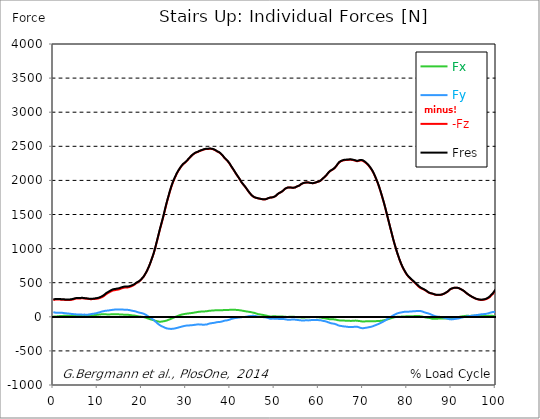
| Category |  Fx |  Fy |  -Fz |  Fres |
|---|---|---|---|---|
| 0.0 | 6.77 | 68.24 | 244.67 | 254.99 |
| 0.16678370786516855 | 5.96 | 65.32 | 247.83 | 257.23 |
| 0.3335674157303371 | 5.31 | 62.63 | 250.74 | 259.34 |
| 0.5003511235955057 | 5.2 | 60.64 | 252.82 | 260.87 |
| 0.6671348314606742 | 5.5 | 59.16 | 254.23 | 261.9 |
| 0.8339185393258427 | 6.13 | 58.37 | 255.19 | 262.7 |
| 1.0007022471910114 | 7.12 | 58.39 | 255 | 262.59 |
| 1.1674859550561796 | 8.33 | 58.54 | 253.81 | 261.53 |
| 1.3342696629213484 | 9.66 | 58.94 | 252.47 | 260.38 |
| 1.5010533707865168 | 10.88 | 59.1 | 251.46 | 259.47 |
| 1.6678370786516854 | 11.76 | 58.99 | 251.12 | 259.21 |
| 1.8346207865168538 | 12.53 | 58.95 | 250.75 | 258.95 |
| 2.001404494382023 | 13.15 | 58.54 | 250.4 | 258.62 |
| 2.1681882022471908 | 13.65 | 56.49 | 250.34 | 258.16 |
| 2.334971910112359 | 14.25 | 54.51 | 249.81 | 257.38 |
| 2.501755617977528 | 15.44 | 54.5 | 247.5 | 255.6 |
| 2.668539325842697 | 16.2 | 53.14 | 246.08 | 254.3 |
| 2.8353230337078656 | 16.72 | 51.03 | 245.19 | 253.27 |
| 3.0021067415730336 | 17 | 50.12 | 244.87 | 253.09 |
| 3.168890449438202 | 17.16 | 49.36 | 244.77 | 253.19 |
| 3.335674157303371 | 17.19 | 48.35 | 244.69 | 253.33 |
| 3.502457865168539 | 17.06 | 47.54 | 245.09 | 253.88 |
| 3.6692415730337076 | 16.56 | 45.88 | 245.7 | 254.63 |
| 3.8360252808988764 | 16.11 | 44.4 | 246.76 | 255.71 |
| 4.002808988764046 | 15.69 | 43.02 | 248.08 | 256.96 |
| 4.169592696629214 | 15.04 | 41.38 | 249.92 | 258.51 |
| 4.3363764044943816 | 14.46 | 40.17 | 252.55 | 260.88 |
| 4.50316011235955 | 13.87 | 39.31 | 255.35 | 263.66 |
| 4.669943820224718 | 13.07 | 38.7 | 258.65 | 266.85 |
| 4.836727528089888 | 12.11 | 38.46 | 262.52 | 270.39 |
| 5.003511235955056 | 11.34 | 36.7 | 266.02 | 273.24 |
| 5.170294943820225 | 10.97 | 35.02 | 267.89 | 274.67 |
| 5.337078651685394 | 10.94 | 34.14 | 268.8 | 275.49 |
| 5.5038623595505625 | 11.17 | 33.52 | 269.2 | 275.87 |
| 5.670646067415731 | 11.69 | 33.95 | 269.04 | 276.06 |
| 5.837429775280899 | 12.12 | 35.11 | 268.19 | 275.79 |
| 6.004213483146067 | 11.76 | 34.64 | 268.47 | 276.12 |
| 6.170997191011236 | 10.75 | 33.51 | 270.1 | 277.31 |
| 6.329002808988764 | 10.42 | 32.67 | 270.91 | 277.79 |
| 6.495786516853932 | 10.38 | 31.97 | 271.08 | 277.71 |
| 6.662570224719101 | 10.25 | 31.25 | 271.05 | 277.47 |
| 6.82935393258427 | 10.48 | 31.51 | 269.79 | 276.24 |
| 6.9961376404494375 | 10.57 | 32.17 | 267.78 | 274.33 |
| 7.162921348314607 | 10.98 | 32.49 | 266.47 | 272.81 |
| 7.329705056179775 | 10.86 | 31.39 | 266.16 | 271.95 |
| 7.496488764044945 | 10.69 | 30.09 | 265.94 | 271.19 |
| 7.663272471910113 | 11.69 | 30.53 | 264.7 | 269.82 |
| 7.830056179775281 | 12.95 | 31.4 | 263.22 | 268.31 |
| 7.996839887640449 | 14.57 | 32.84 | 261.37 | 266.55 |
| 8.16362359550562 | 16.71 | 35.58 | 259.73 | 265.01 |
| 8.330407303370787 | 18.45 | 37.59 | 258.92 | 264.43 |
| 8.497191011235955 | 19.89 | 39.4 | 258.87 | 264.65 |
| 8.663974719101123 | 21.21 | 41.24 | 259.03 | 265.01 |
| 8.830758426966291 | 22.41 | 42.95 | 259.27 | 265.49 |
| 8.99754213483146 | 23.43 | 44.48 | 259.69 | 266.24 |
| 9.16432584269663 | 24.67 | 46.52 | 260.41 | 267.33 |
| 9.331109550561798 | 25.41 | 47.92 | 261.6 | 268.86 |
| 9.497893258426966 | 26.22 | 49.71 | 263.22 | 270.85 |
| 9.664676966292134 | 27.04 | 51.59 | 265.15 | 273.14 |
| 9.831460674157304 | 28.43 | 54.6 | 266.07 | 274.69 |
| 9.998244382022472 | 30.07 | 57.94 | 266.59 | 275.78 |
| 10.16502808988764 | 31 | 60.41 | 269.21 | 278.88 |
| 10.331811797752808 | 32.28 | 63.57 | 272.11 | 282.42 |
| 10.498595505617978 | 33.64 | 67.04 | 275.6 | 286.66 |
| 10.665379213483147 | 34.96 | 70.65 | 279.61 | 291.5 |
| 10.832162921348315 | 36.14 | 74.5 | 284.06 | 296.89 |
| 10.998946629213483 | 37.16 | 78.09 | 288.75 | 302.4 |
| 11.165730337078653 | 37.43 | 81.02 | 293.72 | 307.85 |
| 11.33251404494382 | 36.81 | 81.95 | 300.66 | 314.64 |
| 11.49929775280899 | 36.75 | 84.15 | 308.43 | 322.74 |
| 11.666081460674157 | 36.86 | 87.07 | 316.99 | 331.8 |
| 11.832865168539326 | 36.31 | 89.04 | 326.48 | 341.4 |
| 11.999648876404493 | 35.58 | 90.31 | 334.95 | 349.82 |
| 12.166432584269662 | 34.49 | 89.71 | 341.06 | 355.54 |
| 12.333216292134832 | 34.27 | 90.8 | 347.99 | 362.5 |
| 12.5 | 34.19 | 92.49 | 354.2 | 368.84 |
| 12.66678370786517 | 35.03 | 95.05 | 359.97 | 375.13 |
| 12.833567415730336 | 35.47 | 96.88 | 366.09 | 381.57 |
| 13.000351123595506 | 35.78 | 98.63 | 372.51 | 388.26 |
| 13.167134831460674 | 35.92 | 100.33 | 378.04 | 393.95 |
| 13.333918539325843 | 35.59 | 101.38 | 382.77 | 398.76 |
| 13.500702247191011 | 35.29 | 102.45 | 387.41 | 403.49 |
| 13.667485955056181 | 35.58 | 103.75 | 389.44 | 405.83 |
| 13.834269662921349 | 35.7 | 105.18 | 390.29 | 407.1 |
| 14.001053370786519 | 35.76 | 107.05 | 391.12 | 408.52 |
| 14.167837078651687 | 35.48 | 106.94 | 393.88 | 411.02 |
| 14.334620786516853 | 35.56 | 107.2 | 396.8 | 413.79 |
| 14.501404494382026 | 35.91 | 107.84 | 398.32 | 415.37 |
| 14.668188202247192 | 36.15 | 108.33 | 399.52 | 416.62 |
| 14.834971910112362 | 35.87 | 108.29 | 401.75 | 418.68 |
| 15.001755617977528 | 34.93 | 107.48 | 405.58 | 422.06 |
| 15.168539325842698 | 33.93 | 106.72 | 410.23 | 426.29 |
| 15.335323033707864 | 33 | 106.15 | 414.94 | 430.61 |
| 15.502106741573034 | 32.81 | 106.21 | 418.32 | 433.88 |
| 15.6688904494382 | 32.44 | 105.83 | 421.17 | 436.72 |
| 15.83567415730337 | 31.26 | 104.54 | 424.58 | 439.86 |
| 16.00245786516854 | 31 | 104.65 | 426.95 | 442.21 |
| 16.16924157303371 | 30.51 | 104.22 | 429.89 | 444.89 |
| 16.336025280898877 | 30.11 | 103.46 | 430.72 | 445.42 |
| 16.502808988764045 | 30.5 | 103.91 | 429.28 | 444.19 |
| 16.669592696629216 | 29.94 | 103.01 | 429.83 | 444.42 |
| 16.83637640449438 | 29.27 | 101.98 | 430.6 | 444.8 |
| 17.003160112359552 | 28.29 | 100.57 | 432.49 | 446.19 |
| 17.169943820224717 | 26.95 | 98.7 | 435.69 | 448.73 |
| 17.336727528089888 | 25.54 | 96.62 | 439.25 | 451.59 |
| 17.503511235955056 | 23.83 | 93.93 | 443.56 | 455.03 |
| 17.670294943820224 | 22.12 | 91.17 | 448.25 | 458.86 |
| 17.837078651685395 | 20.47 | 88.41 | 453.55 | 463.36 |
| 18.003862359550563 | 19.4 | 86.38 | 458.48 | 467.72 |
| 18.17064606741573 | 18.46 | 84.69 | 464.38 | 473.19 |
| 18.3374297752809 | 17.52 | 82.89 | 471.57 | 479.97 |
| 18.504213483146067 | 15.92 | 80.27 | 479.82 | 487.67 |
| 18.662219101123597 | 14.4 | 77.2 | 488.22 | 495.38 |
| 18.829002808988765 | 11.99 | 73.23 | 496.5 | 502.74 |
| 18.995786516853933 | 9.49 | 69.12 | 504.52 | 509.89 |
| 19.1625702247191 | 7.38 | 65.64 | 510.95 | 515.73 |
| 19.32935393258427 | 5.55 | 62.9 | 516.37 | 520.7 |
| 19.49613764044944 | 4.31 | 60.51 | 524.13 | 528.15 |
| 19.662921348314608 | 3 | 58.02 | 533.93 | 537.62 |
| 19.829705056179776 | 1.78 | 55.58 | 545.12 | 548.5 |
| 19.996488764044944 | 0.47 | 53.06 | 557.03 | 560.14 |
| 20.163272471910112 | -0.99 | 50.41 | 569.26 | 572.12 |
| 20.33005617977528 | -2.82 | 47.13 | 581.9 | 584.42 |
| 20.49683988764045 | -5.4 | 42.63 | 597.82 | 599.94 |
| 20.663623595505616 | -8.35 | 37.53 | 615.41 | 617.18 |
| 20.830407303370787 | -11.56 | 31.98 | 634.02 | 635.49 |
| 20.997191011235955 | -15.26 | 25.65 | 653.67 | 654.87 |
| 21.163974719101123 | -19.24 | 18.64 | 674.31 | 675.32 |
| 21.330758426966295 | -23.14 | 11.49 | 697.17 | 698.14 |
| 21.497542134831463 | -26.95 | 4.47 | 721.45 | 722.47 |
| 21.66432584269663 | -30.76 | -2.52 | 746.66 | 747.84 |
| 21.8311095505618 | -34.29 | -9.3 | 773.42 | 774.82 |
| 21.997893258426966 | -37.46 | -16.08 | 802.33 | 803.94 |
| 22.164676966292134 | -40.49 | -22.75 | 832.53 | 834.43 |
| 22.331460674157306 | -43.45 | -29.67 | 863.91 | 866.1 |
| 22.498244382022467 | -46.64 | -37.57 | 894.18 | 896.64 |
| 22.66502808988764 | -49.98 | -46.07 | 926.1 | 928.95 |
| 22.831811797752806 | -53.51 | -55.36 | 963.42 | 966.84 |
| 22.99859550561798 | -57.2 | -65.04 | 1002.7 | 1006.77 |
| 23.165379213483146 | -60.67 | -74.74 | 1043.86 | 1048.62 |
| 23.332162921348313 | -63.52 | -84.2 | 1085.75 | 1091.15 |
| 23.49894662921348 | -66.3 | -93.83 | 1128.55 | 1134.61 |
| 23.665730337078653 | -68.82 | -103.27 | 1171.5 | 1178.23 |
| 23.83251404494382 | -71.01 | -112.29 | 1214.82 | 1222.2 |
| 23.999297752808985 | -71.75 | -119.87 | 1256.66 | 1264.52 |
| 24.166081460674157 | -72.25 | -126.82 | 1298.53 | 1306.82 |
| 24.332865168539325 | -71.32 | -132.54 | 1337.68 | 1346.24 |
| 24.499648876404496 | -69.86 | -138.04 | 1378.37 | 1387.14 |
| 24.666432584269664 | -68.48 | -143.17 | 1417.97 | 1426.93 |
| 24.833216292134832 | -66.71 | -148.01 | 1459.51 | 1468.62 |
| 25.0 | -64.48 | -153.1 | 1503.42 | 1512.7 |
| 25.16678370786517 | -62.4 | -158.11 | 1548.12 | 1557.55 |
| 25.33356741573034 | -60.05 | -162.77 | 1592.42 | 1601.98 |
| 25.500351123595504 | -57.54 | -166.95 | 1635.59 | 1645.23 |
| 25.66713483146067 | -54.26 | -170.47 | 1677.56 | 1687.24 |
| 25.833918539325843 | -49.8 | -172.4 | 1717.24 | 1726.78 |
| 26.00070224719101 | -44.96 | -173.77 | 1756.19 | 1765.54 |
| 26.16748595505618 | -40.65 | -175.21 | 1794.8 | 1804 |
| 26.334269662921347 | -36.8 | -176.88 | 1833.61 | 1842.7 |
| 26.50105337078652 | -32.45 | -177.64 | 1870.06 | 1878.98 |
| 26.667837078651687 | -27.68 | -177.36 | 1903.18 | 1911.85 |
| 26.834620786516858 | -22.7 | -176.86 | 1935.41 | 1943.81 |
| 27.001404494382022 | -17.88 | -175.98 | 1965.55 | 1973.69 |
| 27.16818820224719 | -13.28 | -174.42 | 1992.46 | 2000.36 |
| 27.334971910112362 | -8.49 | -172.25 | 2017.78 | 2025.38 |
| 27.50175561797753 | -3.7 | -169.98 | 2041.63 | 2048.97 |
| 27.668539325842698 | 0.84 | -167.71 | 2065.34 | 2072.44 |
| 27.835323033707866 | 5.22 | -165.03 | 2088.49 | 2095.32 |
| 28.002106741573037 | 9.65 | -162.17 | 2109.69 | 2116.25 |
| 28.168890449438205 | 13.98 | -159.19 | 2129.26 | 2135.57 |
| 28.335674157303373 | 18.34 | -156.13 | 2147.59 | 2153.65 |
| 28.502457865168537 | 22.32 | -153.15 | 2164.63 | 2170.44 |
| 28.669241573033705 | 25.71 | -150.31 | 2180.25 | 2185.86 |
| 28.836025280898877 | 29.35 | -147.22 | 2196.32 | 2201.69 |
| 29.002808988764052 | 32.45 | -144.4 | 2211.21 | 2216.39 |
| 29.169592696629213 | 34.82 | -141.86 | 2224.33 | 2229.36 |
| 29.336376404494384 | 37.35 | -139.1 | 2236.45 | 2241.32 |
| 29.50316011235955 | 39.8 | -136.35 | 2246.83 | 2251.56 |
| 29.669943820224724 | 41.55 | -133.58 | 2254.25 | 2258.87 |
| 29.836727528089884 | 43.07 | -131.33 | 2262.78 | 2267.28 |
| 30.003511235955056 | 44.41 | -129.66 | 2272.78 | 2277.16 |
| 30.170294943820224 | 47.63 | -126.87 | 2283.88 | 2288.09 |
| 30.337078651685395 | 48.55 | -127.15 | 2296.14 | 2300.34 |
| 30.503862359550563 | 49.24 | -127.43 | 2308.54 | 2312.72 |
| 30.670646067415728 | 50.36 | -126.82 | 2320.39 | 2324.52 |
| 30.837429775280903 | 52.33 | -125.16 | 2331.25 | 2335.3 |
| 30.99543539325843 | 53.48 | -124.42 | 2343.88 | 2347.88 |
| 31.162219101123597 | 54.5 | -124.13 | 2355.46 | 2359.44 |
| 31.32900280898876 | 55.69 | -123.06 | 2366.09 | 2370.02 |
| 31.495786516853936 | 57.2 | -121.81 | 2375.76 | 2379.65 |
| 31.6625702247191 | 59.25 | -120.29 | 2383.64 | 2387.49 |
| 31.82935393258427 | 61.4 | -118.74 | 2391.14 | 2394.95 |
| 31.996137640449433 | 63.52 | -117.24 | 2398.47 | 2402.24 |
| 32.162921348314605 | 65.12 | -115.87 | 2404.39 | 2408.13 |
| 32.329705056179776 | 66.51 | -114.65 | 2409.54 | 2413.25 |
| 32.49648876404494 | 68.72 | -113 | 2413.45 | 2417.15 |
| 32.66327247191011 | 71.61 | -110.8 | 2417.14 | 2420.82 |
| 32.83005617977528 | 72.19 | -111.24 | 2423.79 | 2427.49 |
| 32.996839887640455 | 73.23 | -111.36 | 2429.13 | 2432.85 |
| 33.16362359550562 | 74.77 | -110.97 | 2433.14 | 2436.88 |
| 33.330407303370784 | 76.12 | -111.24 | 2436.7 | 2440.5 |
| 33.497191011235955 | 76.99 | -113.12 | 2439.49 | 2443.4 |
| 33.66397471910113 | 77.08 | -115.26 | 2443.89 | 2447.91 |
| 33.83075842696629 | 77.3 | -116.39 | 2448.62 | 2452.7 |
| 33.997542134831455 | 78.05 | -115.87 | 2452.34 | 2456.43 |
| 34.164325842696634 | 78.82 | -115.25 | 2455.3 | 2459.38 |
| 34.3311095505618 | 79.87 | -114.36 | 2457.93 | 2462 |
| 34.49789325842697 | 80.17 | -114.02 | 2459.8 | 2463.88 |
| 34.66467696629213 | 80.05 | -113.92 | 2461.5 | 2465.6 |
| 34.831460674157306 | 82.3 | -110.5 | 2461.79 | 2465.86 |
| 34.99824438202247 | 85.93 | -104.34 | 2461.35 | 2465.39 |
| 35.16502808988764 | 87.78 | -101.05 | 2462.41 | 2466.45 |
| 35.331811797752806 | 89.14 | -98.27 | 2463.2 | 2467.23 |
| 35.49859550561798 | 89.7 | -96.65 | 2462.85 | 2466.86 |
| 35.66537921348315 | 90.35 | -94.55 | 2462.17 | 2466.14 |
| 35.83216292134831 | 91.54 | -92.3 | 2460.56 | 2464.49 |
| 35.998946629213485 | 92.21 | -90.98 | 2458.35 | 2462.26 |
| 36.16573033707865 | 92.88 | -89.89 | 2455.62 | 2459.52 |
| 36.33251404494382 | 93.52 | -88.53 | 2451.07 | 2455 |
| 36.499297752808985 | 94.32 | -86.69 | 2445.79 | 2449.7 |
| 36.666081460674164 | 95.43 | -84.32 | 2440.17 | 2444.06 |
| 36.83286516853932 | 96.79 | -81.1 | 2433.27 | 2437.15 |
| 36.99964887640449 | 97.8 | -78.5 | 2425.89 | 2429.73 |
| 37.166432584269664 | 97.37 | -77.44 | 2419.88 | 2423.66 |
| 37.333216292134836 | 95.83 | -77.16 | 2414.99 | 2418.72 |
| 37.5 | 94.33 | -76.84 | 2410.01 | 2413.67 |
| 37.666783707865164 | 94.31 | -75.38 | 2401.98 | 2405.61 |
| 37.833567415730336 | 94.84 | -73.25 | 2392.37 | 2395.96 |
| 38.00035112359551 | 95.66 | -70.79 | 2381.68 | 2385.24 |
| 38.16713483146068 | 96.28 | -68.7 | 2370.65 | 2374.21 |
| 38.333918539325836 | 97.18 | -65 | 2358.51 | 2362.05 |
| 38.50070224719101 | 99.11 | -60.39 | 2343.98 | 2347.51 |
| 38.66748595505618 | 100.54 | -56.8 | 2329.68 | 2333.22 |
| 38.83426966292135 | 100.5 | -55.3 | 2318.56 | 2322.06 |
| 39.001053370786515 | 99.92 | -54.64 | 2309.24 | 2312.7 |
| 39.16783707865169 | 99.65 | -53.85 | 2299.81 | 2303.25 |
| 39.33462078651686 | 99.72 | -51.21 | 2287.49 | 2290.88 |
| 39.50140449438202 | 100.42 | -48.46 | 2274.17 | 2277.57 |
| 39.668188202247194 | 100.96 | -45.77 | 2261.31 | 2264.68 |
| 39.83497191011236 | 101.55 | -41.83 | 2245.82 | 2249.18 |
| 40.00175561797753 | 102.45 | -37.64 | 2229.16 | 2232.54 |
| 40.168539325842694 | 103.13 | -32.5 | 2210.41 | 2213.83 |
| 40.335323033707866 | 103.08 | -29.58 | 2194.05 | 2197.48 |
| 40.50210674157304 | 103.23 | -26.7 | 2178.1 | 2181.49 |
| 40.6688904494382 | 103.26 | -24.22 | 2161.7 | 2165.05 |
| 40.83567415730337 | 103.2 | -21.67 | 2144.74 | 2148.08 |
| 41.00245786516854 | 102.73 | -19.58 | 2127.82 | 2131.13 |
| 41.16924157303371 | 101.99 | -17.96 | 2110.21 | 2113.49 |
| 41.33602528089887 | 101.39 | -16.52 | 2093.28 | 2096.53 |
| 41.502808988764045 | 100.88 | -14.57 | 2076.87 | 2080.1 |
| 41.669592696629216 | 99.72 | -13.2 | 2061.33 | 2064.51 |
| 41.83637640449439 | 98.38 | -12.06 | 2045.67 | 2048.79 |
| 42.00316011235955 | 97.12 | -10.82 | 2029.43 | 2032.49 |
| 42.16994382022472 | 95.66 | -9.14 | 2011.82 | 2014.83 |
| 42.33672752808989 | 94.06 | -7.39 | 1993.98 | 1996.93 |
| 42.50351123595506 | 92.37 | -5.92 | 1975.94 | 1978.83 |
| 42.670294943820224 | 90.43 | -4.69 | 1961.27 | 1964.11 |
| 42.83707865168539 | 88.34 | -4.35 | 1948.16 | 1950.96 |
| 43.00386235955057 | 86.36 | -3.92 | 1934.07 | 1936.84 |
| 43.17064606741573 | 84.34 | -2.97 | 1920.16 | 1922.89 |
| 43.32865168539326 | 82.2 | -2.12 | 1908.03 | 1910.75 |
| 43.495435393258425 | 80.26 | -0.85 | 1895.03 | 1897.72 |
| 43.6622191011236 | 78.71 | 1.4 | 1878.86 | 1881.53 |
| 43.82900280898876 | 77.11 | 3.79 | 1862.68 | 1865.33 |
| 43.99578651685393 | 75.42 | 5.91 | 1847.02 | 1849.63 |
| 44.162570224719104 | 73.82 | 8.15 | 1832.67 | 1835.24 |
| 44.32935393258427 | 72.12 | 9.52 | 1818.73 | 1821.25 |
| 44.49613764044944 | 70.41 | 10.87 | 1804.8 | 1807.27 |
| 44.66292134831461 | 68.28 | 12.01 | 1793 | 1795.41 |
| 44.82970505617978 | 66.11 | 13.13 | 1781.36 | 1783.72 |
| 44.99648876404493 | 63.73 | 13.85 | 1771.8 | 1774.14 |
| 45.16327247191011 | 61.42 | 14.13 | 1763.43 | 1765.72 |
| 45.33005617977528 | 59.2 | 14.06 | 1756.04 | 1758.27 |
| 45.49683988764045 | 56.57 | 13.51 | 1750.32 | 1752.48 |
| 45.66362359550561 | 52.97 | 11.71 | 1746.65 | 1748.67 |
| 45.83040730337079 | 49.37 | 9.68 | 1743.63 | 1745.52 |
| 45.99719101123596 | 45.75 | 7.29 | 1741.07 | 1742.81 |
| 46.16397471910113 | 42.22 | 4.9 | 1738.38 | 1739.99 |
| 46.33075842696629 | 38.82 | 2.25 | 1735.54 | 1737.02 |
| 46.497542134831455 | 36.51 | 0.27 | 1733.17 | 1734.59 |
| 46.66432584269663 | 34.95 | -1.03 | 1731.35 | 1732.75 |
| 46.83110955056179 | 33.5 | -1.35 | 1728.61 | 1729.94 |
| 46.99789325842696 | 31.84 | -1.83 | 1726.2 | 1727.47 |
| 47.164676966292134 | 29.9 | -2.69 | 1724.36 | 1725.59 |
| 47.331460674157306 | 27.95 | -3.56 | 1722.54 | 1723.73 |
| 47.49824438202247 | 25.67 | -4.84 | 1721.6 | 1722.78 |
| 47.66502808988764 | 23.4 | -6.12 | 1720.67 | 1721.83 |
| 47.83181179775281 | 21.38 | -7.12 | 1721.98 | 1723.1 |
| 47.99859550561797 | 19.37 | -8.12 | 1723.3 | 1724.36 |
| 48.16537921348314 | 17.02 | -10.49 | 1726.67 | 1727.71 |
| 48.33216292134831 | 14.46 | -13.77 | 1731.4 | 1732.42 |
| 48.498946629213485 | 11.89 | -17.05 | 1736.14 | 1737.14 |
| 48.66573033707865 | 9.33 | -20.33 | 1740.86 | 1741.85 |
| 48.83251404494382 | 7.2 | -24.13 | 1743.89 | 1744.89 |
| 48.99929775280899 | 5.07 | -27.92 | 1746.91 | 1747.92 |
| 49.166081460674164 | 4.81 | -29.01 | 1748.9 | 1749.93 |
| 49.33286516853933 | 5.77 | -27.7 | 1749.39 | 1750.39 |
| 49.499648876404486 | 6.71 | -26.21 | 1750.34 | 1751.33 |
| 49.666432584269664 | 6.78 | -26.19 | 1752.82 | 1753.81 |
| 49.83321629213483 | 6.26 | -27.28 | 1756.17 | 1757.15 |
| 50.0 | 6.22 | -28.08 | 1761.56 | 1762.55 |
| 50.166783707865164 | 6.44 | -28.73 | 1768.04 | 1769.04 |
| 50.33356741573034 | 6.51 | -29 | 1775.56 | 1776.56 |
| 50.50035112359551 | 6.17 | -29.19 | 1784.43 | 1785.42 |
| 50.66713483146068 | 4.48 | -29.98 | 1796.32 | 1797.32 |
| 50.83391853932584 | 3.95 | -30.51 | 1805.02 | 1806.04 |
| 51.00070224719101 | 4.21 | -30.72 | 1811.88 | 1812.89 |
| 51.16748595505618 | 3.94 | -30.81 | 1817.59 | 1818.57 |
| 51.33426966292134 | 3.84 | -30.81 | 1823.17 | 1824.12 |
| 51.50105337078652 | 4.24 | -30.6 | 1828.68 | 1829.61 |
| 51.66783707865169 | 4.62 | -30.51 | 1835.4 | 1836.34 |
| 51.83462078651686 | 4.43 | -30.85 | 1843.97 | 1844.93 |
| 52.00140449438202 | 2.83 | -32.37 | 1852.97 | 1853.92 |
| 52.168188202247194 | 1.54 | -33.85 | 1865 | 1865.98 |
| 52.33497191011236 | 0.53 | -35.18 | 1874.64 | 1875.61 |
| 52.50175561797752 | -0.34 | -37.29 | 1881.02 | 1881.99 |
| 52.668539325842694 | -1.13 | -39.43 | 1886.33 | 1887.33 |
| 52.835323033707866 | -1.94 | -41.66 | 1891.23 | 1892.26 |
| 53.00210674157304 | -2.06 | -43.28 | 1894.72 | 1895.72 |
| 53.1688904494382 | -1.4 | -43.89 | 1897.17 | 1898.14 |
| 53.33567415730337 | -0.23 | -43.46 | 1896.7 | 1897.67 |
| 53.502457865168545 | 0.63 | -42.41 | 1895.66 | 1896.6 |
| 53.669241573033716 | 0.37 | -41.83 | 1894.43 | 1895.35 |
| 53.83602528089887 | 0.11 | -41.26 | 1893.21 | 1894.1 |
| 54.002808988764045 | -0.18 | -40.85 | 1892.58 | 1893.45 |
| 54.169592696629216 | -0.51 | -40.62 | 1892.6 | 1893.47 |
| 54.33637640449438 | -0.84 | -40.4 | 1892.63 | 1893.51 |
| 54.50316011235955 | -0.96 | -40.84 | 1894.27 | 1895.13 |
| 54.669943820224724 | -1.2 | -41.38 | 1896.22 | 1897.06 |
| 54.836727528089895 | -2.74 | -43 | 1901.42 | 1902.28 |
| 55.00351123595506 | -4.4 | -44.68 | 1908.02 | 1908.94 |
| 55.17029494382022 | -6.53 | -46.95 | 1913.38 | 1914.33 |
| 55.337078651685395 | -7.08 | -48.07 | 1916.92 | 1917.88 |
| 55.50386235955056 | -6.9 | -48.47 | 1919.71 | 1920.68 |
| 55.66186797752809 | -7.26 | -49.63 | 1926.28 | 1927.27 |
| 55.82865168539326 | -8.21 | -51.27 | 1934.63 | 1935.65 |
| 55.995435393258425 | -8.75 | -52.42 | 1943.75 | 1944.8 |
| 56.1622191011236 | -8.89 | -52.82 | 1950 | 1951.08 |
| 56.32900280898877 | -9.1 | -53.25 | 1955.67 | 1956.78 |
| 56.49578651685393 | -9.26 | -53.13 | 1959.48 | 1960.58 |
| 56.6625702247191 | -9.42 | -53.01 | 1963.28 | 1964.38 |
| 56.82935393258427 | -8.97 | -52.46 | 1965.29 | 1966.35 |
| 56.99613764044943 | -8.35 | -52.11 | 1966.8 | 1967.81 |
| 57.16292134831461 | -7.29 | -51.64 | 1970.07 | 1971.04 |
| 57.329705056179776 | -6.87 | -52.39 | 1970.3 | 1971.28 |
| 57.49648876404495 | -7.28 | -52.87 | 1969.59 | 1970.58 |
| 57.66327247191011 | -6.74 | -52.52 | 1968.87 | 1969.83 |
| 57.83005617977529 | -5.84 | -51.49 | 1966.39 | 1967.3 |
| 57.99683988764044 | -5.11 | -50.33 | 1964.35 | 1965.22 |
| 58.16362359550561 | -4.45 | -48.79 | 1963.27 | 1964.14 |
| 58.33040730337079 | -4.15 | -47.93 | 1960.91 | 1961.75 |
| 58.497191011235955 | -3.38 | -46.8 | 1959.31 | 1960.12 |
| 58.66397471910112 | -2.33 | -45.62 | 1958 | 1958.77 |
| 58.83075842696629 | -2.55 | -45.93 | 1959.83 | 1960.61 |
| 58.99754213483147 | -2.85 | -46.19 | 1963.48 | 1964.27 |
| 59.164325842696634 | -3.42 | -46.68 | 1966.09 | 1966.89 |
| 59.33110955056179 | -4.29 | -47.06 | 1968.79 | 1969.59 |
| 59.49789325842697 | -5.24 | -47.47 | 1973.83 | 1974.63 |
| 59.664676966292134 | -6.17 | -47.96 | 1977.82 | 1978.62 |
| 59.8314606741573 | -7.13 | -48.32 | 1980.02 | 1980.84 |
| 59.99824438202247 | -8.06 | -48.99 | 1982.85 | 1983.69 |
| 60.16502808988765 | -8.27 | -49.29 | 1987.18 | 1988.02 |
| 60.33181179775281 | -9.47 | -50.22 | 1992.58 | 1993.46 |
| 60.49859550561798 | -11.56 | -51.45 | 2000.42 | 2001.34 |
| 60.66537921348315 | -14.36 | -54.13 | 2010.3 | 2011.32 |
| 60.83216292134831 | -16.93 | -56.51 | 2020.21 | 2021.33 |
| 60.99894662921348 | -18.86 | -59.68 | 2031.02 | 2032.26 |
| 61.16573033707864 | -20.41 | -62.09 | 2041.55 | 2042.89 |
| 61.33251404494383 | -21.19 | -63.54 | 2049.77 | 2051.18 |
| 61.49929775280899 | -22.84 | -66.15 | 2058.97 | 2060.48 |
| 61.66608146067416 | -24.86 | -69.36 | 2070.57 | 2072.22 |
| 61.83286516853932 | -27.12 | -73.05 | 2083.26 | 2085.07 |
| 61.99964887640451 | -29.64 | -77.03 | 2097.23 | 2099.16 |
| 62.16643258426967 | -32.15 | -81 | 2111.13 | 2113.2 |
| 62.33321629213482 | -33.8 | -84.43 | 2122.87 | 2125.07 |
| 62.5 | -35.44 | -88.31 | 2132.39 | 2134.77 |
| 62.66678370786517 | -37.09 | -92.44 | 2140.82 | 2143.4 |
| 62.833567415730336 | -38.16 | -95.74 | 2148.72 | 2151.45 |
| 63.0003511235955 | -37.39 | -97.77 | 2153.02 | 2155.84 |
| 63.16713483146068 | -37.43 | -99.54 | 2159.59 | 2162.48 |
| 63.33391853932585 | -37.14 | -100.6 | 2166.12 | 2169.05 |
| 63.500702247191015 | -37.96 | -102.49 | 2175.24 | 2178.27 |
| 63.66748595505618 | -39.41 | -105.04 | 2185.74 | 2188.92 |
| 63.83426966292135 | -41.49 | -108.38 | 2198.15 | 2201.5 |
| 64.00105337078651 | -44.19 | -113.13 | 2211.26 | 2214.84 |
| 64.16783707865169 | -46.77 | -118.02 | 2226.7 | 2230.56 |
| 64.33462078651687 | -49.32 | -122.87 | 2242.3 | 2246.43 |
| 64.50140449438203 | -51.41 | -127.17 | 2255.72 | 2260.13 |
| 64.6681882022472 | -52.71 | -130.41 | 2266 | 2270.63 |
| 64.83497191011236 | -53.35 | -132.34 | 2273.22 | 2277.99 |
| 65.00175561797754 | -53.91 | -133.97 | 2279.21 | 2284.09 |
| 65.16853932584269 | -54.3 | -135.93 | 2284.85 | 2289.85 |
| 65.33532303370787 | -54.52 | -137.49 | 2288.4 | 2293.51 |
| 65.50210674157304 | -54.74 | -139.13 | 2292.98 | 2298.18 |
| 65.66889044943821 | -55.24 | -140.65 | 2295.56 | 2300.87 |
| 65.83567415730337 | -55.85 | -141.64 | 2296.8 | 2302.18 |
| 66.00245786516854 | -56.48 | -142.57 | 2297.89 | 2303.35 |
| 66.1692415730337 | -57.54 | -144.12 | 2298.76 | 2304.35 |
| 66.33602528089888 | -58.45 | -145.66 | 2299.49 | 2305.21 |
| 66.50280898876404 | -59.07 | -147.2 | 2300.01 | 2305.84 |
| 66.66959269662921 | -59.4 | -148.3 | 2300.83 | 2306.74 |
| 66.83637640449439 | -59.44 | -148.97 | 2301.95 | 2307.9 |
| 67.00316011235955 | -59.6 | -149.59 | 2302.74 | 2308.72 |
| 67.16994382022472 | -59.84 | -150.19 | 2303.34 | 2309.35 |
| 67.33672752808988 | -59.99 | -150.57 | 2302.38 | 2308.41 |
| 67.50351123595506 | -59.97 | -150.66 | 2300.14 | 2306.19 |
| 67.67029494382022 | -58.89 | -149.72 | 2298.42 | 2304.38 |
| 67.83707865168539 | -58.15 | -149.59 | 2299.45 | 2305.38 |
| 67.99508426966291 | -56.79 | -147.08 | 2294.14 | 2299.9 |
| 68.16186797752809 | -55.75 | -144.95 | 2288.62 | 2294.25 |
| 68.32865168539327 | -55.95 | -144.82 | 2287.47 | 2293.1 |
| 68.49543539325843 | -56.18 | -144.62 | 2284.36 | 2289.98 |
| 68.6622191011236 | -56.62 | -144.67 | 2280.2 | 2285.84 |
| 68.82900280898876 | -59.11 | -148.08 | 2281.11 | 2287 |
| 68.99578651685394 | -60.98 | -152.27 | 2285.42 | 2291.65 |
| 69.1625702247191 | -62.46 | -156.25 | 2289.62 | 2296.17 |
| 69.32935393258425 | -63.38 | -159.32 | 2291.56 | 2298.37 |
| 69.49613764044945 | -65.08 | -162.7 | 2292.6 | 2299.77 |
| 69.66292134831461 | -66.9 | -165.72 | 2292.76 | 2300.27 |
| 69.82970505617978 | -68.28 | -167.34 | 2290.58 | 2298.28 |
| 69.99648876404494 | -69.04 | -167.54 | 2286.23 | 2293.96 |
| 70.16327247191012 | -68.4 | -166.1 | 2279.48 | 2287.1 |
| 70.33005617977528 | -67.85 | -164.49 | 2272.07 | 2279.55 |
| 70.49683988764045 | -66.84 | -162.39 | 2264.05 | 2271.35 |
| 70.66362359550561 | -66.53 | -160.76 | 2255.74 | 2262.92 |
| 70.83040730337079 | -66.22 | -159.12 | 2247.43 | 2254.48 |
| 70.99719101123596 | -65.84 | -157.15 | 2236.76 | 2243.66 |
| 71.16397471910112 | -65.61 | -155.25 | 2224.85 | 2231.61 |
| 71.3307584269663 | -65.52 | -153.26 | 2212.06 | 2218.68 |
| 71.49754213483146 | -65.57 | -151.16 | 2198.6 | 2205.09 |
| 71.66432584269663 | -65.86 | -148.56 | 2184.36 | 2190.68 |
| 71.83110955056179 | -66.6 | -146.31 | 2168.68 | 2174.86 |
| 71.99789325842697 | -67.05 | -143.5 | 2151.86 | 2157.88 |
| 72.16467696629215 | -66.94 | -139.79 | 2133.61 | 2139.39 |
| 72.3314606741573 | -66.52 | -135.7 | 2113.31 | 2118.84 |
| 72.49824438202248 | -66.3 | -131.93 | 2091.68 | 2097.01 |
| 72.66502808988764 | -65.58 | -127.64 | 2068.22 | 2073.32 |
| 72.8318117977528 | -64.58 | -122.99 | 2042.67 | 2047.51 |
| 72.99859550561797 | -63.53 | -118.34 | 2016.38 | 2020.95 |
| 73.16537921348315 | -62.98 | -114.29 | 1989.91 | 1994.27 |
| 73.33216292134833 | -62.67 | -110.25 | 1962.43 | 1966.6 |
| 73.49894662921349 | -62.08 | -105.74 | 1933.04 | 1937.01 |
| 73.66573033707864 | -61.14 | -100.56 | 1901.2 | 1904.93 |
| 73.83251404494382 | -60.2 | -95.42 | 1868.36 | 1871.85 |
| 73.99929775280899 | -59.02 | -90.12 | 1833.88 | 1837.13 |
| 74.16608146067415 | -57.57 | -84.48 | 1798.04 | 1801.03 |
| 74.33286516853933 | -55.92 | -78.88 | 1761.8 | 1764.54 |
| 74.49964887640449 | -53.83 | -73.43 | 1725.04 | 1727.52 |
| 74.66643258426967 | -51.52 | -67.77 | 1687.35 | 1689.58 |
| 74.83321629213484 | -49 | -61.67 | 1648.86 | 1650.83 |
| 75.0 | -46.27 | -55.1 | 1608.5 | 1610.19 |
| 75.16678370786516 | -43.68 | -48.7 | 1566.43 | 1567.89 |
| 75.33356741573033 | -41.03 | -42.14 | 1523.07 | 1524.34 |
| 75.5003511235955 | -38.43 | -35.73 | 1480 | 1481.1 |
| 75.66713483146067 | -35.3 | -28.4 | 1437.29 | 1438.17 |
| 75.83391853932585 | -31.69 | -20.52 | 1394.03 | 1394.8 |
| 76.00070224719101 | -28.3 | -13.24 | 1351.8 | 1352.44 |
| 76.16748595505618 | -24.76 | -6.41 | 1309.97 | 1310.5 |
| 76.33426966292136 | -21.07 | 0.35 | 1267.61 | 1268.05 |
| 76.50105337078652 | -17.67 | 7.27 | 1224.22 | 1224.67 |
| 76.66783707865167 | -14.46 | 13.83 | 1181.72 | 1182.23 |
| 76.83462078651685 | -11.35 | 20.26 | 1139.73 | 1140.31 |
| 77.00140449438202 | -8.68 | 26.17 | 1099.93 | 1100.62 |
| 77.1681882022472 | -6.5 | 31.81 | 1062.53 | 1063.43 |
| 77.33497191011236 | -4.38 | 37.32 | 1025.62 | 1026.74 |
| 77.50175561797754 | -2.26 | 42.49 | 988.41 | 989.77 |
| 77.6685393258427 | -0.65 | 47.16 | 953.51 | 955.14 |
| 77.83532303370787 | 0.27 | 51.02 | 920.63 | 922.54 |
| 78.00210674157303 | 0.98 | 54.63 | 888.3 | 890.5 |
| 78.1688904494382 | 1.65 | 57.76 | 856.25 | 858.72 |
| 78.33567415730337 | 1.98 | 59.9 | 825.96 | 828.64 |
| 78.50245786516854 | 2.29 | 61.9 | 797.82 | 800.7 |
| 78.66924157303372 | 2.65 | 64.21 | 770.86 | 774.03 |
| 78.83602528089888 | 3.15 | 66.69 | 745.99 | 749.48 |
| 79.00280898876404 | 3.65 | 68.67 | 722.81 | 726.63 |
| 79.16959269662921 | 4.64 | 70.56 | 701.68 | 705.8 |
| 79.33637640449439 | 5.52 | 72.3 | 680.99 | 685.39 |
| 79.50316011235955 | 6.03 | 73.32 | 661.55 | 666.16 |
| 79.66994382022472 | 6.3 | 74.06 | 642.8 | 647.61 |
| 79.8367275280899 | 6.66 | 74.8 | 625.7 | 630.68 |
| 80.00351123595506 | 6.62 | 74.81 | 610.55 | 615.64 |
| 80.17029494382022 | 6.87 | 75.14 | 596.73 | 601.96 |
| 80.32830056179776 | 7.12 | 75.53 | 584.43 | 589.85 |
| 80.49508426966293 | 7.3 | 75.83 | 573.36 | 578.96 |
| 80.66186797752809 | 7.71 | 76.5 | 563.05 | 568.85 |
| 80.82865168539325 | 8.29 | 77.51 | 552.28 | 558.31 |
| 80.99543539325842 | 8.86 | 78.65 | 541.65 | 547.97 |
| 81.1622191011236 | 9.17 | 79.53 | 532.05 | 538.68 |
| 81.32900280898878 | 9.42 | 80.37 | 522.63 | 529.57 |
| 81.49578651685394 | 9.99 | 81.02 | 512.03 | 519.21 |
| 81.6625702247191 | 10.43 | 81.65 | 501.11 | 508.56 |
| 81.82935393258427 | 10.9 | 82.71 | 490.33 | 498.14 |
| 81.99613764044945 | 11.17 | 83.52 | 479.91 | 488 |
| 82.16292134831461 | 11.31 | 84.13 | 469.66 | 477.96 |
| 82.32970505617978 | 11.2 | 84.52 | 459.49 | 467.99 |
| 82.49648876404494 | 11.01 | 85.16 | 449.38 | 458.12 |
| 82.66327247191012 | 11.28 | 85.8 | 438.35 | 447.33 |
| 82.83005617977528 | 9.91 | 84.47 | 429.79 | 438.6 |
| 82.99683988764045 | 8.95 | 84.26 | 422.31 | 431.11 |
| 83.16362359550563 | 7.3 | 82.76 | 416.53 | 425.09 |
| 83.33040730337079 | 5.05 | 80.08 | 411.4 | 419.5 |
| 83.49719101123596 | 2.1 | 75.86 | 406.89 | 414.29 |
| 83.66397471910112 | -1.05 | 70.94 | 402.38 | 409 |
| 83.8307584269663 | -3.9 | 67.54 | 396.6 | 402.72 |
| 83.99754213483146 | -6.75 | 64.03 | 390.75 | 396.49 |
| 84.16432584269663 | -9.69 | 60.13 | 385.1 | 390.46 |
| 84.33110955056179 | -11.6 | 56.9 | 377.83 | 382.93 |
| 84.49789325842697 | -12.76 | 54.42 | 369.35 | 374.24 |
| 84.66467696629213 | -13.81 | 51.47 | 361.42 | 366.08 |
| 84.8314606741573 | -15.23 | 48.22 | 354.98 | 359.38 |
| 84.99824438202248 | -17.05 | 44.57 | 350.09 | 354.13 |
| 85.16502808988764 | -19.3 | 40.59 | 345.95 | 349.55 |
| 85.3318117977528 | -22.02 | 36 | 343.31 | 346.52 |
| 85.49859550561797 | -25.07 | 30.93 | 341.07 | 343.99 |
| 85.66537921348315 | -27.91 | 25.84 | 338.57 | 341.22 |
| 85.83216292134831 | -29.28 | 20.7 | 335.42 | 337.91 |
| 85.99894662921348 | -29.58 | 16.11 | 331.64 | 334.13 |
| 86.16573033707866 | -29.16 | 12.72 | 327.55 | 330.03 |
| 86.33251404494384 | -28.63 | 9.57 | 323.67 | 326.11 |
| 86.499297752809 | -27.44 | 7.82 | 320.99 | 323.3 |
| 86.66608146067415 | -27.46 | 4.89 | 319.89 | 322.13 |
| 86.83286516853933 | -27.39 | 1.77 | 319.74 | 321.93 |
| 86.99964887640449 | -26.71 | -0.37 | 319.79 | 321.97 |
| 87.16643258426966 | -25.26 | 0.01 | 319.99 | 321.91 |
| 87.33321629213482 | -24.08 | -0.05 | 320.33 | 322.03 |
| 87.5 | -24.15 | -2.08 | 321.43 | 323.07 |
| 87.66678370786518 | -24.36 | -4.18 | 322.98 | 324.58 |
| 87.83356741573033 | -24.55 | -6.14 | 325.37 | 326.99 |
| 88.00035112359551 | -24.72 | -7.27 | 329.08 | 330.74 |
| 88.16713483146067 | -25.48 | -9.85 | 333.39 | 335.17 |
| 88.33391853932584 | -26.2 | -13.63 | 337.5 | 339.48 |
| 88.500702247191 | -26.51 | -16.29 | 342.73 | 344.89 |
| 88.66748595505618 | -26.51 | -17.91 | 349.6 | 351.85 |
| 88.83426966292136 | -26.85 | -21.22 | 356.34 | 358.76 |
| 89.00105337078652 | -26.68 | -25.25 | 362.05 | 364.65 |
| 89.16783707865169 | -26.51 | -27.96 | 368.69 | 371.39 |
| 89.33462078651687 | -26.12 | -31.02 | 378.11 | 380.93 |
| 89.50140449438203 | -25.61 | -34.39 | 388.68 | 391.63 |
| 89.6681882022472 | -25.05 | -37.61 | 399.06 | 402.12 |
| 89.83497191011236 | -23.15 | -37.86 | 405.94 | 408.79 |
| 90.00175561797754 | -21.52 | -37.82 | 411.34 | 413.98 |
| 90.16853932584269 | -19.77 | -36.92 | 414.82 | 417.24 |
| 90.33532303370787 | -17.65 | -35.42 | 418.21 | 420.38 |
| 90.50210674157303 | -15.09 | -33.8 | 422.16 | 424.1 |
| 90.6688904494382 | -13.22 | -32.76 | 425.37 | 427.14 |
| 90.83567415730336 | -11.48 | -31.47 | 426.66 | 428.3 |
| 91.00245786516854 | -9.65 | -29.61 | 426.13 | 427.65 |
| 91.1692415730337 | -8.14 | -27.96 | 425.64 | 427.07 |
| 91.33602528089888 | -6.49 | -26.51 | 424.55 | 425.89 |
| 91.50280898876404 | -4.64 | -24.77 | 422.81 | 424.04 |
| 91.66959269662922 | -2.92 | -23.05 | 419.78 | 420.95 |
| 91.83637640449439 | -0.59 | -20.47 | 414.86 | 415.96 |
| 92.00316011235955 | 2.2 | -17.05 | 409.15 | 410.23 |
| 92.16994382022472 | 4.46 | -13.55 | 403.05 | 404.09 |
| 92.3367275280899 | 6.2 | -10.77 | 397.44 | 398.46 |
| 92.50351123595506 | 7.51 | -8.76 | 392.06 | 393.06 |
| 92.66151685393258 | 8.9 | -6.54 | 385.36 | 386.4 |
| 92.82830056179776 | 10.42 | -4.1 | 377.81 | 378.91 |
| 92.99508426966291 | 11.74 | -1.57 | 368.75 | 369.99 |
| 93.16186797752809 | 12.98 | 0.98 | 359.16 | 360.56 |
| 93.32865168539325 | 14.04 | 3.27 | 350.44 | 351.97 |
| 93.49543539325842 | 14.73 | 5.24 | 342.54 | 344.19 |
| 93.66221910112358 | 15.33 | 7.57 | 333.33 | 335.12 |
| 93.82900280898876 | 15.33 | 9.45 | 324.57 | 326.34 |
| 93.99578651685393 | 13.25 | 8.96 | 318.62 | 320.14 |
| 94.1625702247191 | 12.71 | 9.73 | 312.38 | 313.79 |
| 94.32935393258427 | 13.49 | 11.74 | 305.2 | 306.58 |
| 94.49613764044945 | 13.87 | 13.53 | 298.65 | 300 |
| 94.66292134831461 | 14.86 | 15.84 | 291.92 | 293.33 |
| 94.82970505617978 | 15.25 | 17.8 | 286.25 | 287.78 |
| 94.99648876404494 | 15.76 | 19.73 | 280.53 | 282.22 |
| 95.16327247191012 | 16.03 | 21.26 | 275.02 | 276.88 |
| 95.33005617977528 | 16.23 | 22.74 | 269.64 | 271.68 |
| 95.49683988764046 | 16.01 | 23.93 | 265.06 | 267.33 |
| 95.66362359550563 | 15.74 | 25.12 | 260.6 | 263.09 |
| 95.83040730337078 | 14.75 | 26.32 | 257.74 | 260.38 |
| 95.99719101123594 | 14.02 | 27.64 | 254.85 | 257.69 |
| 96.16397471910112 | 13.55 | 29.17 | 251.92 | 255.06 |
| 96.33075842696628 | 13.58 | 31.3 | 249.61 | 253.36 |
| 96.49754213483145 | 13.75 | 33.57 | 247.63 | 252.04 |
| 96.66432584269663 | 13.96 | 35.83 | 246.52 | 251.5 |
| 96.8311095505618 | 14.05 | 37.77 | 246 | 251.37 |
| 96.99789325842697 | 13.55 | 38.71 | 246.78 | 252.29 |
| 97.16467696629213 | 12.72 | 39.16 | 248.39 | 254 |
| 97.3314606741573 | 12.14 | 39.33 | 250.42 | 256.09 |
| 97.49824438202248 | 11.55 | 39.5 | 252.45 | 258.19 |
| 97.66502808988764 | 11.56 | 41.06 | 254.98 | 261.02 |
| 97.8318117977528 | 12.11 | 43.26 | 258.32 | 264.78 |
| 97.99859550561798 | 12.75 | 45.77 | 262.46 | 269.37 |
| 98.16537921348316 | 13.35 | 47.85 | 267.42 | 274.72 |
| 98.33216292134833 | 13.94 | 51.06 | 274.28 | 282.25 |
| 98.49894662921349 | 14.75 | 54.6 | 280.84 | 289.61 |
| 98.66573033707866 | 15.53 | 58.31 | 288.17 | 297.78 |
| 98.8325140449438 | 15.08 | 61.36 | 299.65 | 309.47 |
| 98.99929775280897 | 14.58 | 64.33 | 312.58 | 322.59 |
| 99.16608146067416 | 14.16 | 66.83 | 322.27 | 332.38 |
| 99.33286516853933 | 13.63 | 69.19 | 331.82 | 341.97 |
| 99.49964887640449 | 11.2 | 69.06 | 347.07 | 356.66 |
| 99.66643258426966 | 8.7 | 68.76 | 362.74 | 371.85 |
| 99.83321629213484 | 6.37 | 68.61 | 378.22 | 387 |
| 100.0 | 4.04 | 68.45 | 393.71 | 402.15 |